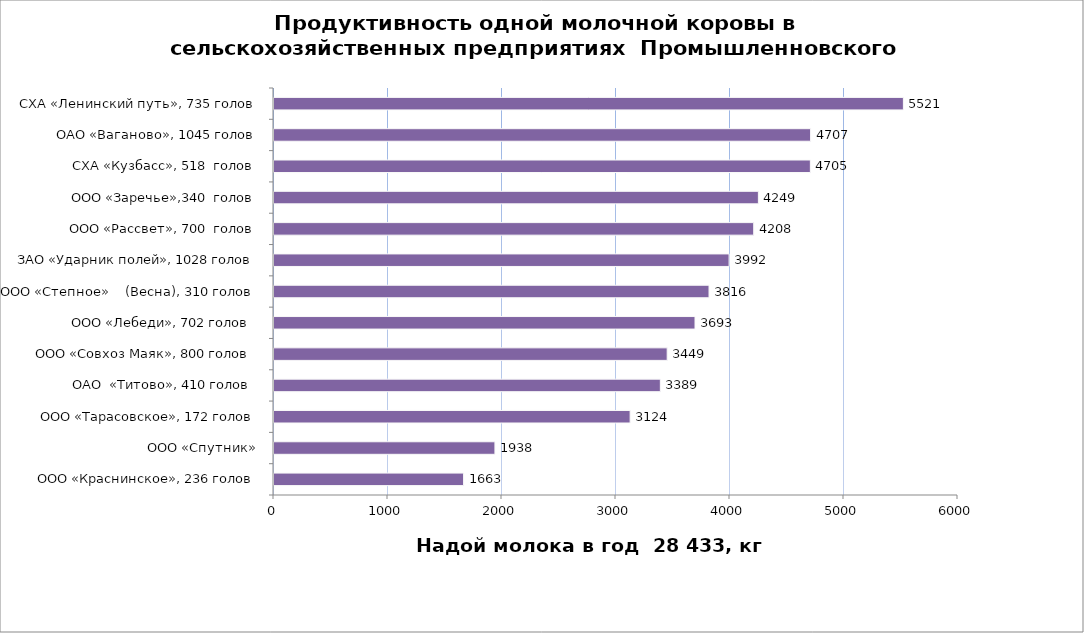
| Category | Series 0 |
|---|---|
| ООО «Краснинское», 236 голов | 1663 |
| ООО «Спутник» | 1938 |
| ООО «Тарасовское», 172 голов | 3124 |
| ОАО  «Титово», 410 голов  | 3389 |
| ООО «Совхоз Маяк», 800 голов  | 3449 |
| ООО «Лебеди», 702 голов  | 3693 |
| ООО «Степное»    (Весна), 310 голов | 3816 |
| ЗАО «Ударник полей», 1028 голов | 3992 |
| ООО «Рассвет», 700  голов | 4208 |
| ООО «Заречье»,340  голов | 4249 |
| СХА «Кузбасс», 518  голов | 4705 |
| ОАО «Ваганово», 1045 голов | 4707 |
| СХА «Ленинский путь», 735 голов | 5521 |